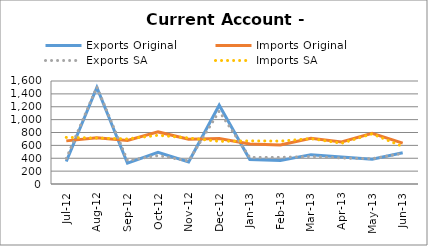
| Category | Exports Original | Imports Original | Exports SA | Imports SA |
|---|---|---|---|---|
| 2012-07-11 | 349 | 670 | 397 | 724 |
| 2012-08-11 | 1501 | 720 | 1507 | 714 |
| 2012-09-11 | 323 | 675 | 365 | 700 |
| 2012-10-11 | 491 | 809 | 442 | 757 |
| 2012-11-11 | 343 | 696 | 358 | 715 |
| 2012-12-11 | 1224 | 708 | 1132 | 663 |
| 2013-01-11 | 379 | 620 | 413 | 670 |
| 2013-02-11 | 366 | 605 | 414 | 666 |
| 2013-03-11 | 456 | 711 | 426 | 705 |
| 2013-04-11 | 421 | 652 | 404 | 633 |
| 2013-05-11 | 386 | 786 | 392 | 779 |
| 2013-06-11 | 485 | 636 | 477 | 583 |